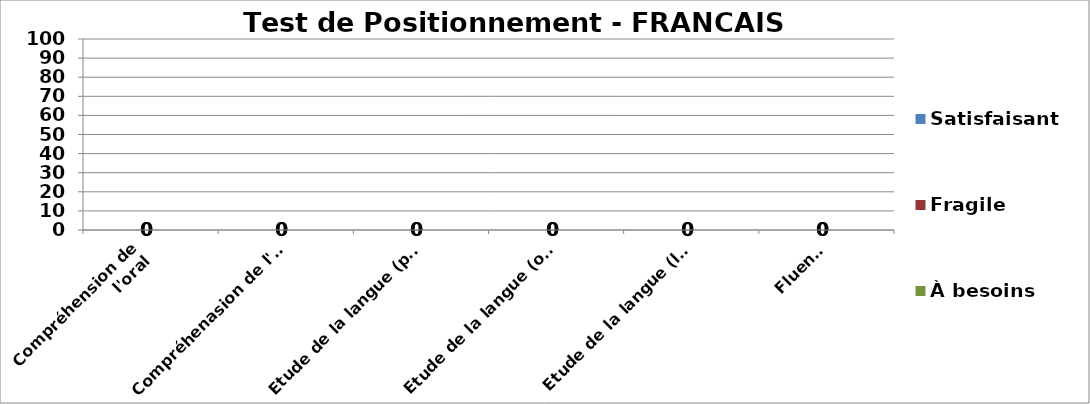
| Category | À besoins | Fragile | Satisfaisant |
|---|---|---|---|
| Compréhension de l'oral
 | 0 | 0 | 0 |
| Compréhenasion de l'écrit | 0 | 0 | 0 |
| Etude de la langue (phrase, composition) | 0 | 0 | 0 |
| Etude de la langue (orthographe) | 0 | 0 | 0 |
| Etude de la langue (lexique) | 0 | 0 | 0 |
| Fluence | 0 | 0 | 0 |